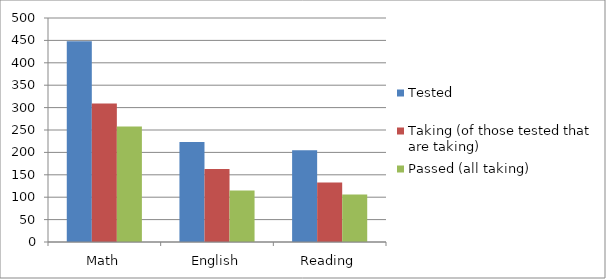
| Category | Tested | Taking (of those tested that are taking) | Passed (all taking) |
|---|---|---|---|
| Math | 448 | 309 | 258 |
| English | 223 | 163 | 115 |
| Reading | 205 | 133 | 106 |